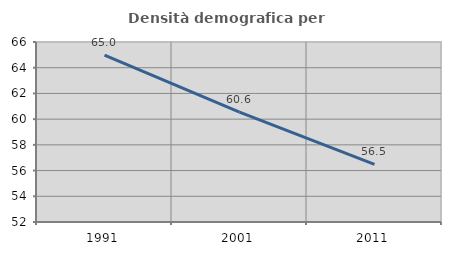
| Category | Densità demografica |
|---|---|
| 1991.0 | 64.98 |
| 2001.0 | 60.552 |
| 2011.0 | 56.484 |